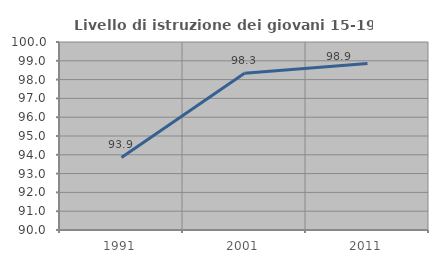
| Category | Livello di istruzione dei giovani 15-19 anni |
|---|---|
| 1991.0 | 93.86 |
| 2001.0 | 98.333 |
| 2011.0 | 98.851 |